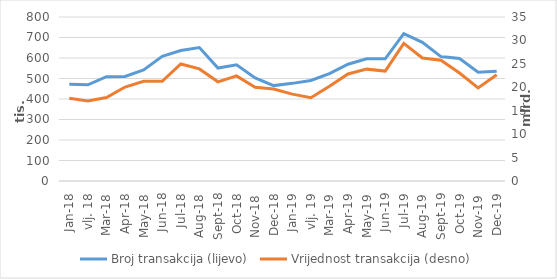
| Category | Broj transakcija (lijevo) |
|---|---|
| sij.18 | 471967 |
| vlj. 18 | 469498 |
| ožu.18 | 509056 |
| tra.18 | 510115 |
| svi.18 | 541723 |
| lip.18 | 608176 |
| srp.18 | 636470 |
| kol.18 | 650778 |
| ruj.18 | 550921 |
| lis.18 | 566941 |
| stu.18 | 502969 |
| pro.18 | 465407 |
| sij.19 | 476280 |
| vlj. 19 | 490220 |
| ožu.19 | 523506 |
| tra.19 | 569607 |
| svi.19 | 596357 |
| lip.19 | 595773 |
| srp.19 | 718880 |
| kol.19 | 676521 |
| ruj.19 | 606974 |
| lis.19 | 597555 |
| stu.19 | 531100 |
| pro.19 | 535262 |